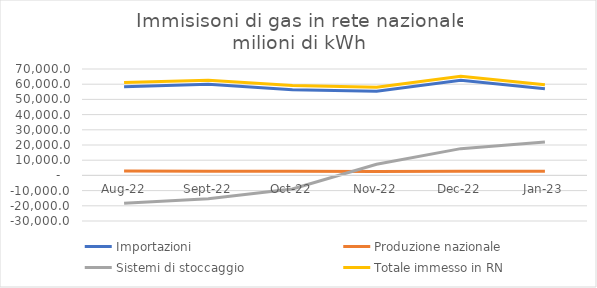
| Category | Importazioni | Produzione nazionale | Sistemi di stoccaggio | Totale immesso in RN |
|---|---|---|---|---|
| 2022-08-01 | 58241.799 | 2852.473 | -18331.617 | 61094.272 |
| 2022-09-01 | 59887.752 | 2758.783 | -15358.926 | 62646.535 |
| 2022-10-01 | 56314.634 | 2783.058 | -8986.433 | 59097.692 |
| 2022-11-01 | 55382.533 | 2646.398 | 7339.773 | 58028.931 |
| 2022-12-01 | 62519.727 | 2742.162 | 17606.296 | 65261.889 |
| 2023-01-01 | 57022.574 | 2677.366 | 21997.59 | 59699.94 |